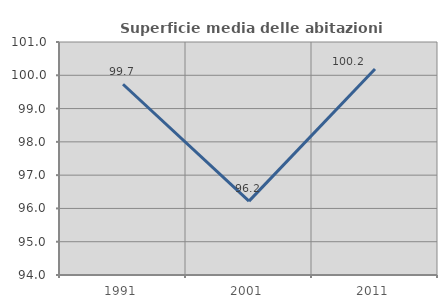
| Category | Superficie media delle abitazioni occupate |
|---|---|
| 1991.0 | 99.731 |
| 2001.0 | 96.219 |
| 2011.0 | 100.188 |